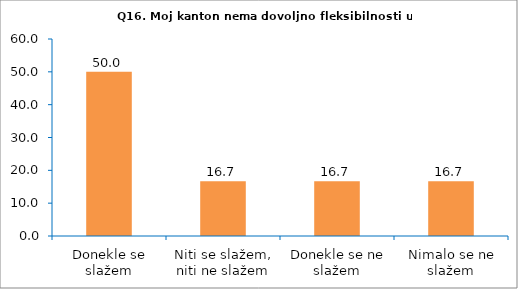
| Category | Series 0 |
|---|---|
| Donekle se slažem | 50 |
| Niti se slažem, niti ne slažem | 16.667 |
| Donekle se ne slažem | 16.667 |
| Nimalo se ne slažem | 16.667 |